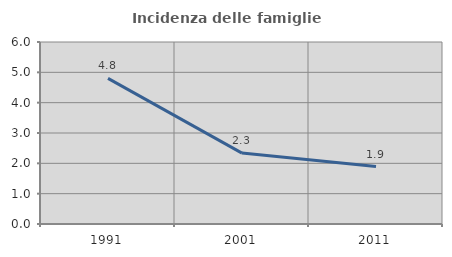
| Category | Incidenza delle famiglie numerose |
|---|---|
| 1991.0 | 4.799 |
| 2001.0 | 2.338 |
| 2011.0 | 1.895 |